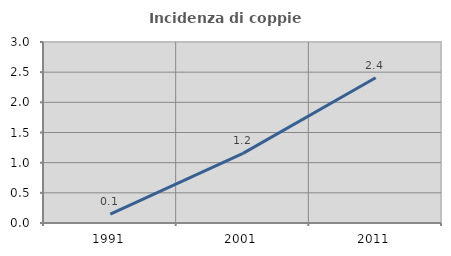
| Category | Incidenza di coppie miste |
|---|---|
| 1991.0 | 0.148 |
| 2001.0 | 1.154 |
| 2011.0 | 2.407 |